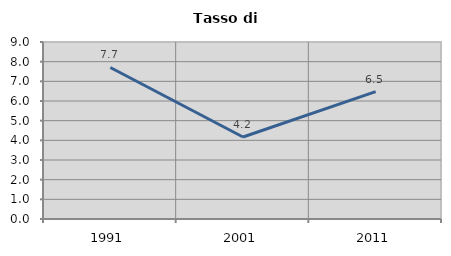
| Category | Tasso di disoccupazione   |
|---|---|
| 1991.0 | 7.705 |
| 2001.0 | 4.171 |
| 2011.0 | 6.478 |